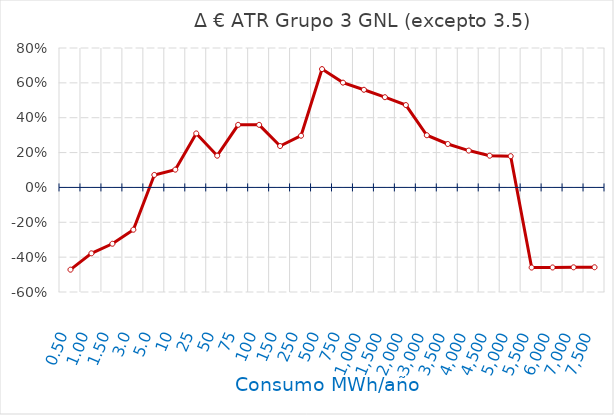
| Category | D €/año |
|---|---|
| 0.5 | -0.472 |
| 1.0 | -0.378 |
| 1.5 | -0.323 |
| 3.0 | -0.243 |
| 5.0 | 0.072 |
| 10.0 | 0.102 |
| 25.0 | 0.31 |
| 50.0 | 0.182 |
| 75.0 | 0.359 |
| 100.0 | 0.359 |
| 150.0 | 0.237 |
| 250.0 | 0.297 |
| 500.0 | 0.679 |
| 750.0 | 0.601 |
| 1000.0 | 0.56 |
| 1500.0 | 0.518 |
| 2000.0 | 0.473 |
| 3000.0 | 0.299 |
| 3500.0 | 0.249 |
| 4000.0 | 0.212 |
| 4500.0 | 0.182 |
| 5000.0 | 0.179 |
| 5500.0 | -0.46 |
| 6000.0 | -0.459 |
| 7000.0 | -0.458 |
| 7500.0 | -0.458 |